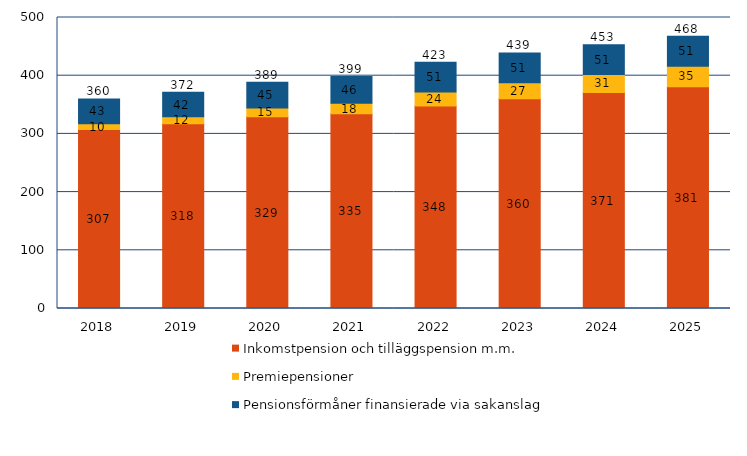
| Category | Inkomstpension och tilläggspension m.m. | Premiepensioner | Pensionsförmåner finansierade via sakanslag | Series 3 |
|---|---|---|---|---|
| 2018.0 | 307.356 | 10.141 | 42.55 | 360.046 |
| 2019.0 | 317.628 | 11.715 | 42.22 | 371.563 |
| 2020.0 | 329.365 | 15.016 | 44.546 | 388.927 |
| 2021.0 | 334.624 | 17.837 | 46.326 | 398.787 |
| 2022.0 | 348.104 | 23.784 | 51.227 | 423.115 |
| 2023.0 | 360.459 | 27.307 | 51.44 | 439.206 |
| 2024.0 | 371.068 | 31.176 | 50.929 | 453.173 |
| 2025.0 | 381.041 | 35.409 | 51.33 | 467.78 |